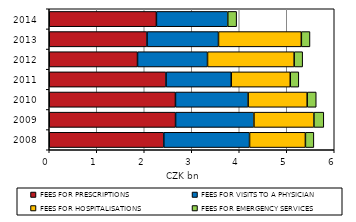
| Category | FEES FOR PRESCRIPTIONS | FEES FOR VISITS TO A PHYSICIAN | FEES FOR HOSPITALISATIONS | FEES FOR EMERGENCY SERVICES |
|---|---|---|---|---|
| 2008.0 | 2411 | 1806 | 1176 | 178 |
| 2009.0 | 2659 | 1650 | 1263 | 208 |
| 2010.0 | 2657 | 1530 | 1243 | 191 |
| 2011.0 | 2458 | 1374 | 1242 | 180 |
| 2012.0 | 1858 | 1474 | 1824 | 179 |
| 2013.0 | 2058 | 1505 | 1744 | 182 |
| 2014.0 | 2256 | 1502 | 0 | 187 |